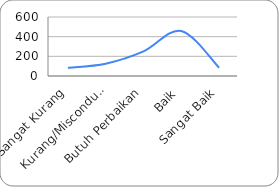
| Category | Pola Distribusi |
|---|---|
| Sangat Kurang | 83.333 |
| Kurang/Misconduct | 125 |
| Butuh Perbaikan | 250 |
| Baik | 458.333 |
| Sangat Baik | 83.333 |